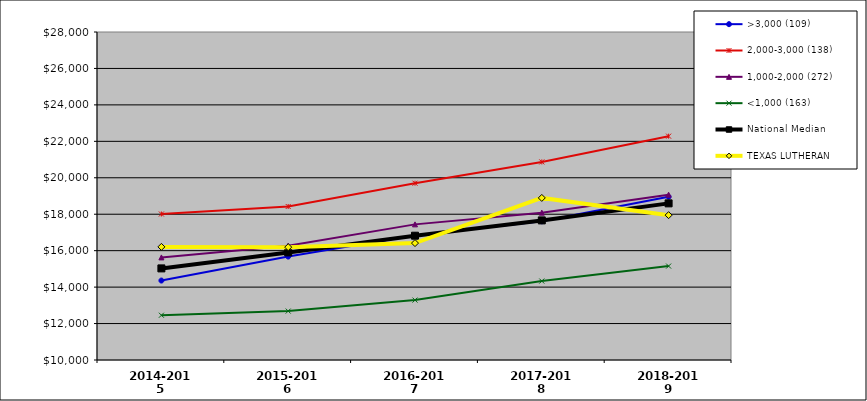
| Category | >3,000 (109) | 2,000-3,000 (138) | 1,000-2,000 (272) | <1,000 (163) | National Median | TEXAS LUTHERAN |
|---|---|---|---|---|---|---|
| 2014-2015 | 14360 | 18011.5 | 15629.5 | 12457 | 15026.5 | 16208 |
| 2015-2016 | 15675 | 18424.5 | 16270 | 12685 | 15904.5 | 16193 |
| 2016-2017 | 16839 | 19702.5 | 17443 | 13288 | 16820.5 | 16415 |
| 2017-2018 | 17614 | 20870 | 18086.5 | 14332 | 17661 | 18895 |
| 2018-2019 | 18958 | 22283.5 | 19073.5 | 15155 | 18596 | 17949 |